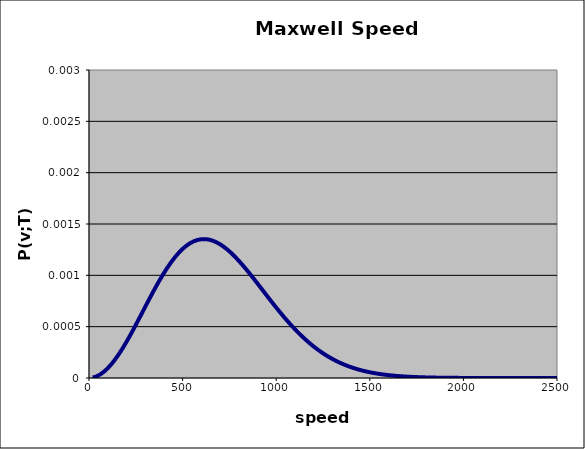
| Category | P(v) [s/m] |
|---|---|
| 20.0 | 0 |
| 40.0 | 0 |
| 60.0 | 0 |
| 80.0 | 0 |
| 100.0 | 0 |
| 120.0 | 0 |
| 140.0 | 0 |
| 160.0 | 0 |
| 180.0 | 0 |
| 200.0 | 0 |
| 220.0 | 0 |
| 240.0 | 0 |
| 260.0 | 0.001 |
| 280.0 | 0.001 |
| 300.0 | 0.001 |
| 320.0 | 0.001 |
| 340.0 | 0.001 |
| 360.0 | 0.001 |
| 380.0 | 0.001 |
| 400.0 | 0.001 |
| 420.0 | 0.001 |
| 440.0 | 0.001 |
| 460.0 | 0.001 |
| 480.0 | 0.001 |
| 500.0 | 0.001 |
| 520.0 | 0.001 |
| 540.0 | 0.001 |
| 560.0 | 0.001 |
| 580.0 | 0.001 |
| 600.0 | 0.001 |
| 620.0 | 0.001 |
| 640.0 | 0.001 |
| 660.0 | 0.001 |
| 680.0 | 0.001 |
| 700.0 | 0.001 |
| 720.0 | 0.001 |
| 740.0 | 0.001 |
| 760.0 | 0.001 |
| 780.0 | 0.001 |
| 800.0 | 0.001 |
| 820.0 | 0.001 |
| 840.0 | 0.001 |
| 860.0 | 0.001 |
| 880.0 | 0.001 |
| 900.0 | 0.001 |
| 920.0 | 0.001 |
| 940.0 | 0.001 |
| 960.0 | 0.001 |
| 980.0 | 0.001 |
| 1000.0 | 0.001 |
| 1020.0 | 0.001 |
| 1040.0 | 0.001 |
| 1060.0 | 0.001 |
| 1080.0 | 0.001 |
| 1100.0 | 0 |
| 1120.0 | 0 |
| 1140.0 | 0 |
| 1160.0 | 0 |
| 1180.0 | 0 |
| 1200.0 | 0 |
| 1220.0 | 0 |
| 1240.0 | 0 |
| 1260.0 | 0 |
| 1280.0 | 0 |
| 1300.0 | 0 |
| 1320.0 | 0 |
| 1340.0 | 0 |
| 1360.0 | 0 |
| 1380.0 | 0 |
| 1400.0 | 0 |
| 1420.0 | 0 |
| 1440.0 | 0 |
| 1460.0 | 0 |
| 1480.0 | 0 |
| 1500.0 | 0 |
| 1520.0 | 0 |
| 1540.0 | 0 |
| 1560.0 | 0 |
| 1580.0 | 0 |
| 1600.0 | 0 |
| 1620.0 | 0 |
| 1640.0 | 0 |
| 1660.0 | 0 |
| 1680.0 | 0 |
| 1700.0 | 0 |
| 1720.0 | 0 |
| 1740.0 | 0 |
| 1760.0 | 0 |
| 1780.0 | 0 |
| 1800.0 | 0 |
| 1820.0 | 0 |
| 1840.0 | 0 |
| 1860.0 | 0 |
| 1880.0 | 0 |
| 1900.0 | 0 |
| 1920.0 | 0 |
| 1940.0 | 0 |
| 1960.0 | 0 |
| 1980.0 | 0 |
| 2000.0 | 0 |
| 2020.0 | 0 |
| 2040.0 | 0 |
| 2060.0 | 0 |
| 2080.0 | 0 |
| 2100.0 | 0 |
| 2120.0 | 0 |
| 2140.0 | 0 |
| 2160.0 | 0 |
| 2180.0 | 0 |
| 2200.0 | 0 |
| 2220.0 | 0 |
| 2240.0 | 0 |
| 2260.0 | 0 |
| 2280.0 | 0 |
| 2300.0 | 0 |
| 2320.0 | 0 |
| 2340.0 | 0 |
| 2360.0 | 0 |
| 2380.0 | 0 |
| 2400.0 | 0 |
| 2420.0 | 0 |
| 2440.0 | 0 |
| 2460.0 | 0 |
| 2480.0 | 0 |
| 2500.0 | 0 |
| 2520.0 | 0 |
| 2540.0 | 0 |
| 2560.0 | 0 |
| 2580.0 | 0 |
| 2600.0 | 0 |
| 2620.0 | 0 |
| 2640.0 | 0 |
| 2660.0 | 0 |
| 2680.0 | 0 |
| 2700.0 | 0 |
| 2720.0 | 0 |
| 2740.0 | 0 |
| 2760.0 | 0 |
| 2780.0 | 0 |
| 2800.0 | 0 |
| 2820.0 | 0 |
| 2840.0 | 0 |
| 2860.0 | 0 |
| 2880.0 | 0 |
| 2900.0 | 0 |
| 2920.0 | 0 |
| 2940.0 | 0 |
| 2960.0 | 0 |
| 2980.0 | 0 |
| 3000.0 | 0 |
| 3020.0 | 0 |
| 3040.0 | 0 |
| 3060.0 | 0 |
| 3080.0 | 0 |
| 3100.0 | 0 |
| 3120.0 | 0 |
| 3140.0 | 0 |
| 3160.0 | 0 |
| 3180.0 | 0 |
| 3200.0 | 0 |
| 3220.0 | 0 |
| 3240.0 | 0 |
| 3260.0 | 0 |
| 3280.0 | 0 |
| 3300.0 | 0 |
| 3320.0 | 0 |
| 3340.0 | 0 |
| 3360.0 | 0 |
| 3380.0 | 0 |
| 3400.0 | 0 |
| 3420.0 | 0 |
| 3440.0 | 0 |
| 3460.0 | 0 |
| 3480.0 | 0 |
| 3500.0 | 0 |
| 3520.0 | 0 |
| 3540.0 | 0 |
| 3560.0 | 0 |
| 3580.0 | 0 |
| 3600.0 | 0 |
| 3620.0 | 0 |
| 3640.0 | 0 |
| 3660.0 | 0 |
| 3680.0 | 0 |
| 3700.0 | 0 |
| 3720.0 | 0 |
| 3740.0 | 0 |
| 3760.0 | 0 |
| 3780.0 | 0 |
| 3800.0 | 0 |
| 3820.0 | 0 |
| 3840.0 | 0 |
| 3860.0 | 0 |
| 3880.0 | 0 |
| 3900.0 | 0 |
| 3920.0 | 0 |
| 3940.0 | 0 |
| 3960.0 | 0 |
| 3980.0 | 0 |